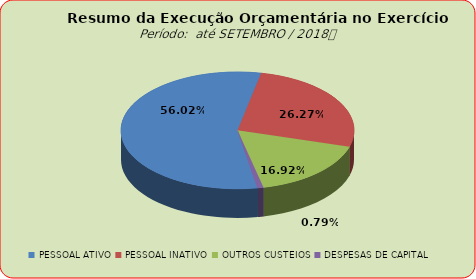
| Category | Series 0 |
|---|---|
| PESSOAL ATIVO | 111801137.1 |
| PESSOAL INATIVO | 52419296.27 |
| OUTROS CUSTEIOS | 33772413.14 |
| DESPESAS DE CAPITAL | 1571236.67 |